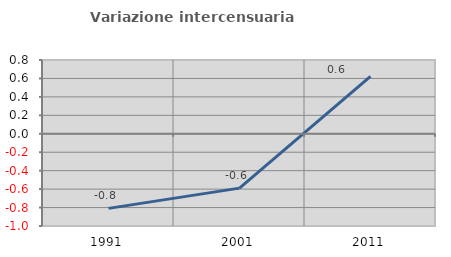
| Category | Variazione intercensuaria annua |
|---|---|
| 1991.0 | -0.809 |
| 2001.0 | -0.589 |
| 2011.0 | 0.623 |